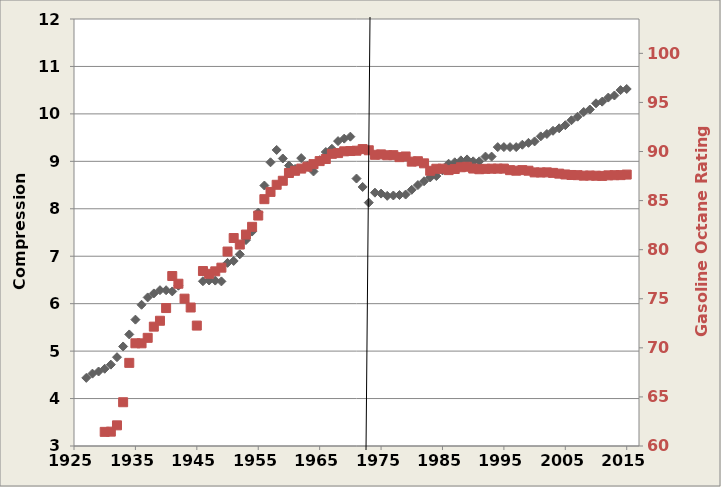
| Category | Average Compression Ratio for New Light Vehicles |
|---|---|
| 1927.0 | 4.436 |
| 1928.0 | 4.525 |
| 1929.0 | 4.57 |
| 1930.0 | 4.628 |
| 1931.0 | 4.715 |
| 1932.0 | 4.871 |
| 1933.0 | 5.098 |
| 1934.0 | 5.351 |
| 1935.0 | 5.663 |
| 1936.0 | 5.977 |
| 1937.0 | 6.131 |
| 1938.0 | 6.216 |
| 1939.0 | 6.284 |
| 1940.0 | 6.283 |
| 1941.0 | 6.258 |
| 1942.0 | 6.378 |
| 1943.0 | 0 |
| 1944.0 | 0 |
| 1945.0 | 0 |
| 1946.0 | 6.473 |
| 1947.0 | 6.488 |
| 1948.0 | 6.487 |
| 1949.0 | 6.47 |
| 1950.0 | 6.86 |
| 1951.0 | 6.9 |
| 1952.0 | 7.04 |
| 1953.0 | 7.34 |
| 1954.0 | 7.52 |
| 1955.0 | 7.92 |
| 1956.0 | 8.49 |
| 1957.0 | 8.98 |
| 1958.0 | 9.24 |
| 1959.0 | 9.06 |
| 1960.0 | 8.91 |
| 1961.0 | 8.84 |
| 1962.0 | 9.068 |
| 1963.0 | 8.906 |
| 1964.0 | 8.786 |
| 1965.0 | 9.025 |
| 1966.0 | 9.197 |
| 1967.0 | 9.265 |
| 1968.0 | 9.426 |
| 1969.0 | 9.479 |
| 1970.0 | 9.52 |
| 1971.0 | 8.638 |
| 1972.0 | 8.46 |
| 1973.0 | 8.13 |
| 1974.0 | 8.34 |
| 1975.0 | 8.32 |
| 1976.0 | 8.273 |
| 1977.0 | 8.28 |
| 1978.0 | 8.29 |
| 1979.0 | 8.3 |
| 1980.0 | 8.4 |
| 1981.0 | 8.5 |
| 1982.0 | 8.58 |
| 1983.0 | 8.66 |
| 1984.0 | 8.69 |
| 1985.0 | 8.81 |
| 1986.0 | 8.95 |
| 1987.0 | 8.98 |
| 1988.0 | 9.02 |
| 1989.0 | 9.04 |
| 1990.0 | 9 |
| 1991.0 | 9 |
| 1992.0 | 9.1 |
| 1993.0 | 9.1 |
| 1994.0 | 9.3 |
| 1995.0 | 9.3 |
| 1996.0 | 9.3 |
| 1997.0 | 9.3 |
| 1998.0 | 9.35 |
| 1999.0 | 9.39 |
| 2000.0 | 9.42 |
| 2001.0 | 9.526 |
| 2002.0 | 9.576 |
| 2003.0 | 9.644 |
| 2004.0 | 9.696 |
| 2005.0 | 9.761 |
| 2006.0 | 9.866 |
| 2007.0 | 9.941 |
| 2008.0 | 10.04 |
| 2009.0 | 10.092 |
| 2010.0 | 10.223 |
| 2011.0 | 10.258 |
| 2012.0 | 10.344 |
| 2013.0 | 10.388 |
| 2014.0 | 10.501 |
| 2015.0 | 10.525 |